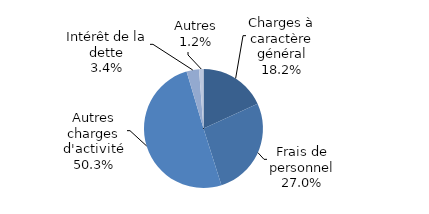
| Category | Series 0 |
|---|---|
| Charges à caractère général | 0.182 |
| Frais de personnel | 0.27 |
| Autres charges d'activité | 0.503 |
| Intérêt de la dette | 0.034 |
| Autres | 0.012 |